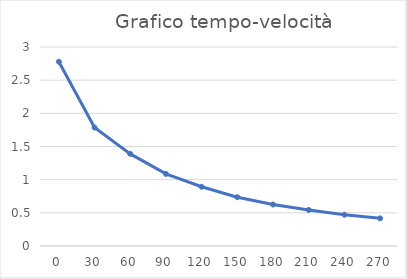
| Category | Series 0 |
|---|---|
| 0.0 | 2.778 |
| 30.0 | 1.786 |
| 60.0 | 1.389 |
| 90.0 | 1.087 |
| 120.0 | 0.893 |
| 150.0 | 0.735 |
| 180.0 | 0.625 |
| 210.0 | 0.543 |
| 240.0 | 0.472 |
| 270.0 | 0.417 |